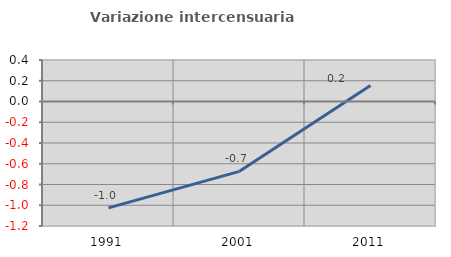
| Category | Variazione intercensuaria annua |
|---|---|
| 1991.0 | -1.026 |
| 2001.0 | -0.673 |
| 2011.0 | 0.153 |